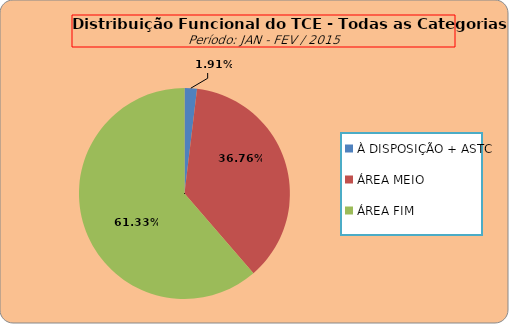
| Category | ÁREAS DE ATUAÇÃO |
|---|---|
| À DISPOSIÇÃO + ASTC | 10 |
| ÁREA MEIO | 193 |
| ÁREA FIM | 322 |